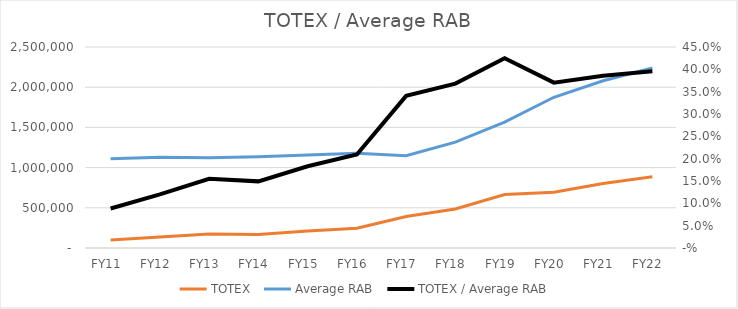
| Category | TOTEX | Average RAB |
|---|---|---|
| FY11  | 98199.808 | 1109608.415 |
| FY12  | 135393.728 | 1128156.824 |
| FY13  | 173870.162 | 1121973.037 |
| FY14  | 169416.473 | 1135727.626 |
| FY15  | 211462.219 | 1155270.638 |
| FY16  | 246748.802 | 1178631.007 |
| FY17  | 390661.297 | 1147241.015 |
| FY18  | 484372.092 | 1316393.404 |
| FY19  | 665103.525 | 1566005.445 |
| FY20  | 694167.589 | 1874789.549 |
| FY21  | 802524.422 | 2080708.189 |
| FY22  | 885775.188 | 2239490.078 |